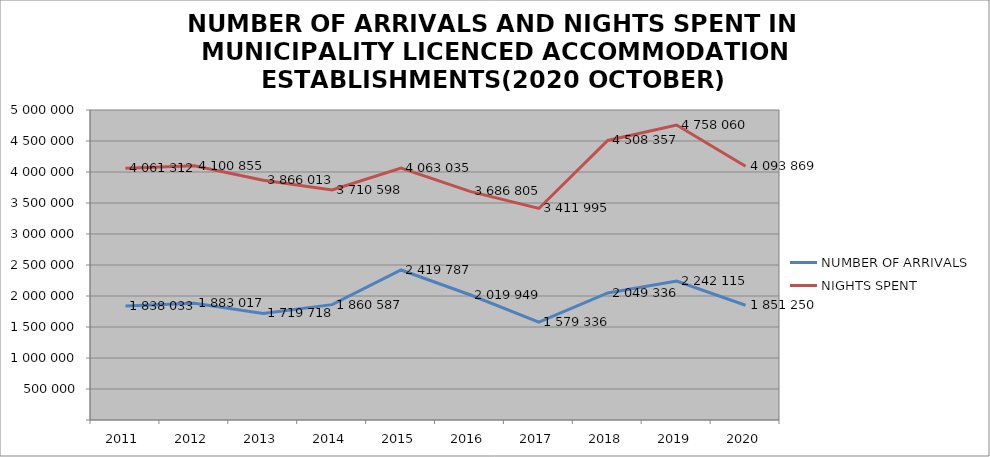
| Category | NUMBER OF ARRIVALS | NIGHTS SPENT |
|---|---|---|
| 2011 | 1838033 | 4061312 |
| 2012 | 1883017 | 4100855 |
| 2013 | 1719718 | 3866013 |
| 2014 | 1860587 | 3710598 |
| 2015 | 2419787 | 4063035 |
| 2016 | 2019949 | 3686805 |
| 2017 | 1579336 | 3411995 |
| 2018 | 2049336 | 4508357 |
| 2019 | 2242115 | 4758060 |
| 2020 | 1851250 | 4093869 |